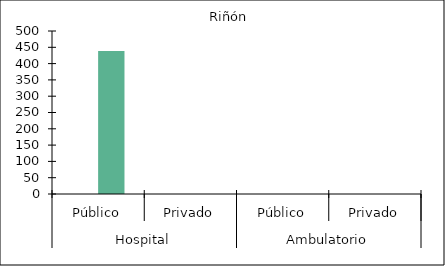
| Category |   |    Riñón |
|---|---|---|
| 0 | 0 | 439 |
| 1 | 0 | 0 |
| 2 | 0 | 0 |
| 3 | 0 | 0 |